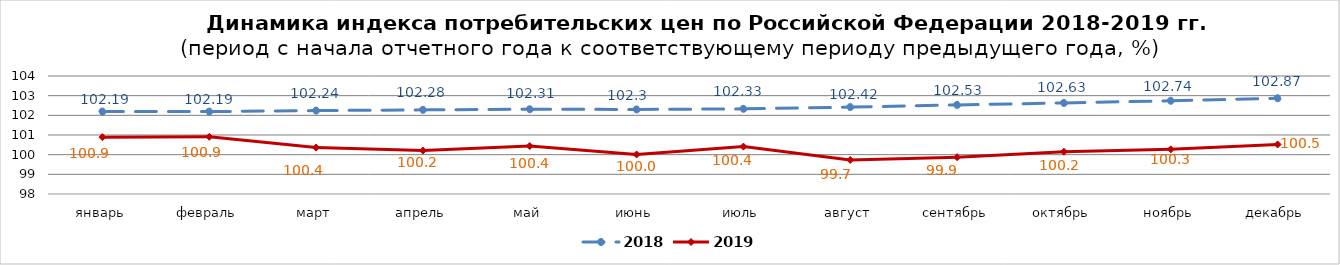
| Category | 2018 | 2019 |
|---|---|---|
| январь | 102.19 | 100.89 |
| февраль | 102.19 | 100.91 |
| март | 102.24 | 100.36 |
| апрель | 102.28 | 100.21 |
| май | 102.31 | 100.44 |
| июнь | 102.3 | 100.01 |
| июль | 102.33 | 100.41 |
| август | 102.42 | 99.73 |
| сентябрь | 102.53 | 99.87 |
| октябрь | 102.63 | 100.15 |
| ноябрь | 102.74 | 100.27 |
| декабрь | 102.87 | 100.52 |